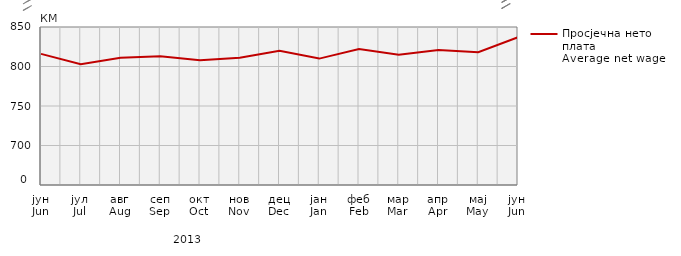
| Category | Просјечна нето плата
Average net wage |
|---|---|
| јун
Jun | 816 |
| јул
Jul | 803 |
| авг
Aug | 811 |
| сеп
Sep | 813 |
| окт
Oct | 808 |
| нов
Nov | 811 |
| дец
Dec | 820 |
| јан
Jan | 810 |
| феб
Feb | 822 |
| мар
Mar | 815 |
| апр
Apr | 821 |
| мај
May | 818 |
| јун
Jun | 837 |